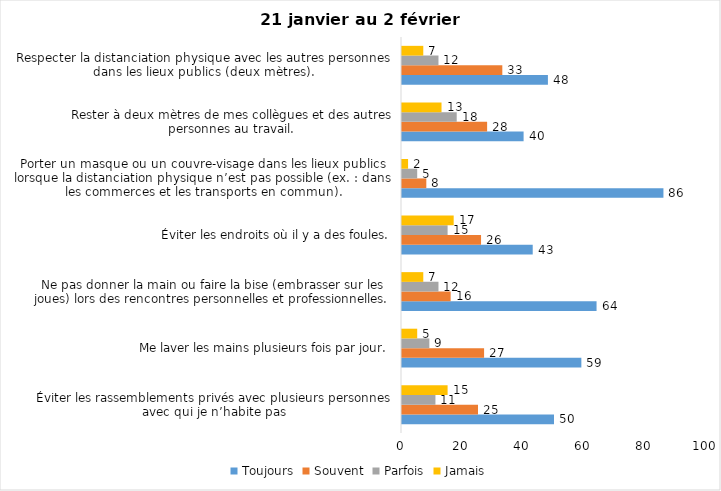
| Category | Toujours | Souvent | Parfois | Jamais |
|---|---|---|---|---|
| Éviter les rassemblements privés avec plusieurs personnes avec qui je n’habite pas | 50 | 25 | 11 | 15 |
| Me laver les mains plusieurs fois par jour. | 59 | 27 | 9 | 5 |
| Ne pas donner la main ou faire la bise (embrasser sur les joues) lors des rencontres personnelles et professionnelles. | 64 | 16 | 12 | 7 |
| Éviter les endroits où il y a des foules. | 43 | 26 | 15 | 17 |
| Porter un masque ou un couvre-visage dans les lieux publics lorsque la distanciation physique n’est pas possible (ex. : dans les commerces et les transports en commun). | 86 | 8 | 5 | 2 |
| Rester à deux mètres de mes collègues et des autres personnes au travail. | 40 | 28 | 18 | 13 |
| Respecter la distanciation physique avec les autres personnes dans les lieux publics (deux mètres). | 48 | 33 | 12 | 7 |